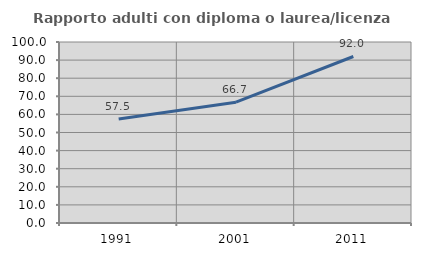
| Category | Rapporto adulti con diploma o laurea/licenza media  |
|---|---|
| 1991.0 | 57.477 |
| 2001.0 | 66.726 |
| 2011.0 | 92 |